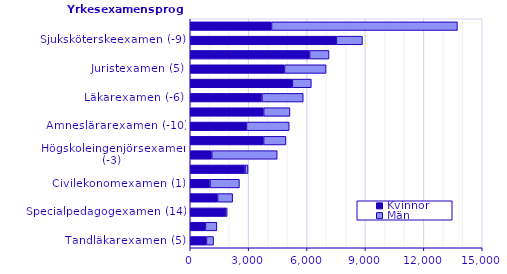
| Category | Kvinnor | Män |
|---|---|---|
| Tandläkarexamen (5) | 833 | 365 |
| Fysioterapeutexamen (-13) | 778 | 589 |
| Specialpedagogexamen (14) | 1804 | 94 |
| Arkitektexamen (-3) | 1402 | 777 |
| Civilekonomexamen (1) | 1012 | 1514 |
| Förskollärarexamen (-18) | 2813 | 156 |
| Högskoleingenjörsexamen (-3) | 1102 | 3365 |
| Grundlärarexamen (-14) | 3769 | 1147 |
| Ämneslärarexamen (-10) | 2887 | 2197 |
| Psykologexamen (-5) | 3770 | 1351 |
| Läkarexamen (-6) | 3682 | 2122 |
| Socionomexamen (-10) | 5246 | 975 |
| Juristexamen (5) | 4840 | 2138 |
| Specialistsjuksköterskeexamen (5) | 6133 | 994 |
| Sjuksköterskeexamen (-9) | 7507 | 1339 |
| Civilingenjörsexamen (2) | 4175 | 9550 |